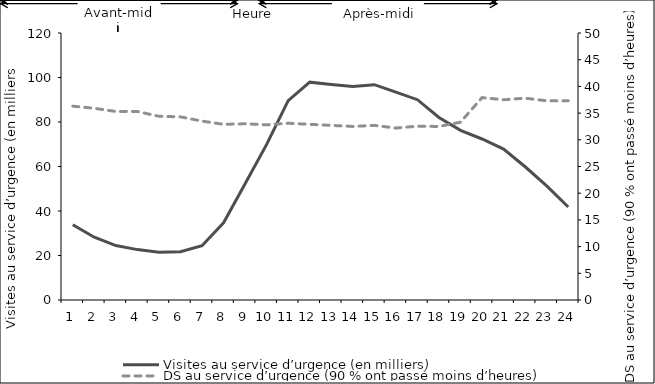
| Category | Visites au service d’urgence (en milliers) |
|---|---|
| 0 | 33.831 |
| 1 | 28.213 |
| 2 | 24.45 |
| 3 | 22.651 |
| 4 | 21.499 |
| 5 | 21.71 |
| 6 | 24.374 |
| 7 | 34.685 |
| 8 | 52.235 |
| 9 | 69.947 |
| 10 | 89.572 |
| 11 | 97.901 |
| 12 | 96.864 |
| 13 | 95.943 |
| 14 | 96.785 |
| 15 | 93.397 |
| 16 | 90.021 |
| 17 | 82.022 |
| 18 | 76.222 |
| 19 | 72.36 |
| 20 | 67.842 |
| 21 | 59.885 |
| 22 | 51.307 |
| 23 | 41.819 |